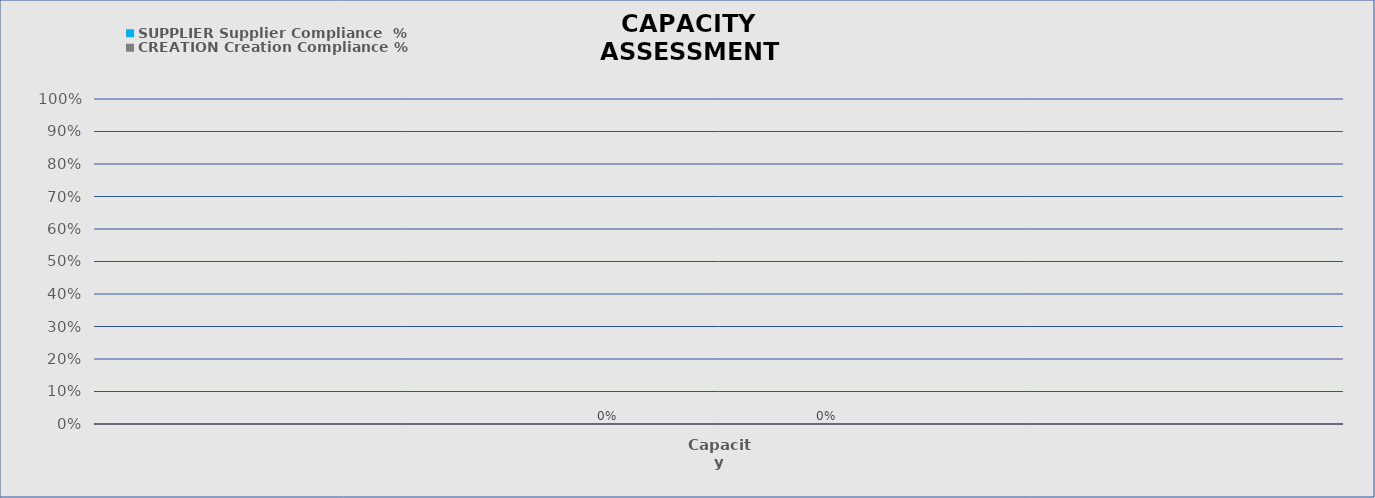
| Category | SUPPLIER | CREATION |
|---|---|---|
| Capacity | 0 | 0 |